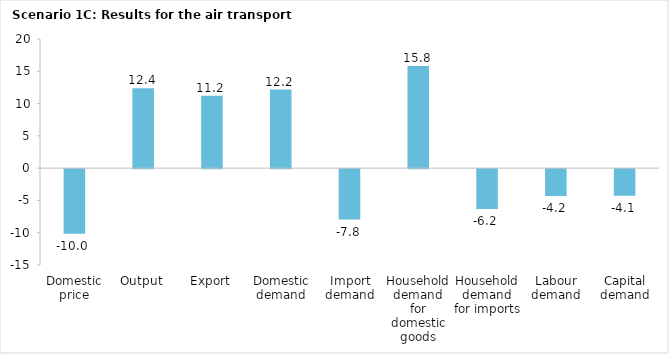
| Category | Series 0 |
|---|---|
| Domestic price | -10 |
| Output | 12.389 |
| Export | 11.228 |
| Domestic demand | 12.176 |
| Import demand | -7.803 |
| Household demand for domestic goods | 15.829 |
| Household demand for imports | -6.178 |
| Labour demand | -4.169 |
| Capital demand | -4.124 |